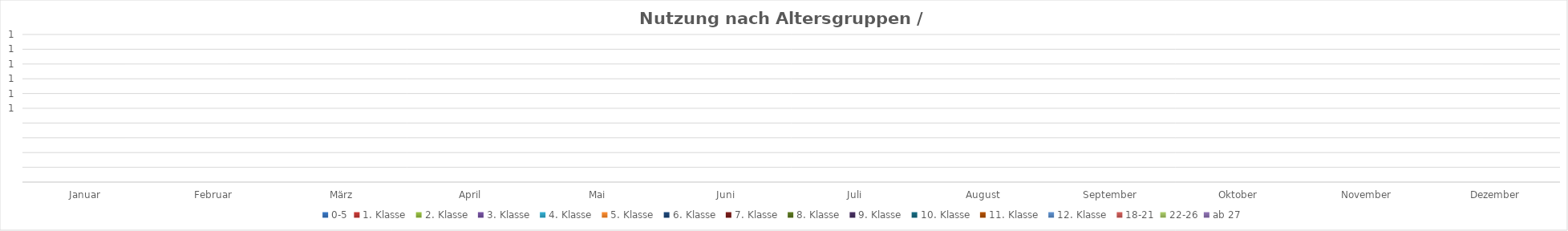
| Category | 0-5 | 1. Klasse  | 2. Klasse  | 3. Klasse  | 4. Klasse  | 5. Klasse  | 6. Klasse  | 7. Klasse  | 8. Klasse  | 9. Klasse  | 10. Klasse  | 11. Klasse  | 12. Klasse  | 18-21 | 22-26 | ab 27 |
|---|---|---|---|---|---|---|---|---|---|---|---|---|---|---|---|---|
| Januar | 0 | 0 | 0 | 0 | 0 | 0 | 0 | 0 | 0 | 0 | 0 | 0 | 0 | 0 | 0 | 0 |
| Februar | 0 | 0 | 0 | 0 | 0 | 0 | 0 | 0 | 0 | 0 | 0 | 0 | 0 | 0 | 0 | 0 |
| März | 0 | 0 | 0 | 0 | 0 | 0 | 0 | 0 | 0 | 0 | 0 | 0 | 0 | 0 | 0 | 0 |
| April | 0 | 0 | 0 | 0 | 0 | 0 | 0 | 0 | 0 | 0 | 0 | 0 | 0 | 0 | 0 | 0 |
| Mai | 0 | 0 | 0 | 0 | 0 | 0 | 0 | 0 | 0 | 0 | 0 | 0 | 0 | 0 | 0 | 0 |
| Juni | 0 | 0 | 0 | 0 | 0 | 0 | 0 | 0 | 0 | 0 | 0 | 0 | 0 | 0 | 0 | 0 |
| Juli | 0 | 0 | 0 | 0 | 0 | 0 | 0 | 0 | 0 | 0 | 0 | 0 | 0 | 0 | 0 | 0 |
| August | 0 | 0 | 0 | 0 | 0 | 0 | 0 | 0 | 0 | 0 | 0 | 0 | 0 | 0 | 0 | 0 |
| September | 0 | 0 | 0 | 0 | 0 | 0 | 0 | 0 | 0 | 0 | 0 | 0 | 0 | 0 | 0 | 0 |
| Oktober | 0 | 0 | 0 | 0 | 0 | 0 | 0 | 0 | 0 | 0 | 0 | 0 | 0 | 0 | 0 | 0 |
| November | 0 | 0 | 0 | 0 | 0 | 0 | 0 | 0 | 0 | 0 | 0 | 0 | 0 | 0 | 0 | 0 |
| Dezember | 0 | 0 | 0 | 0 | 0 | 0 | 0 | 0 | 0 | 0 | 0 | 0 | 0 | 0 | 0 | 0 |